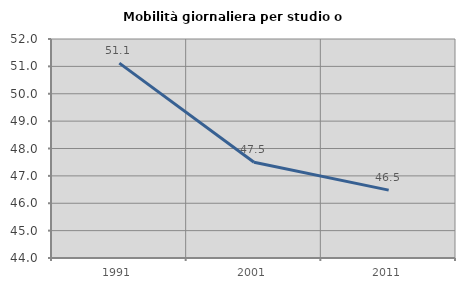
| Category | Mobilità giornaliera per studio o lavoro |
|---|---|
| 1991.0 | 51.119 |
| 2001.0 | 47.496 |
| 2011.0 | 46.479 |